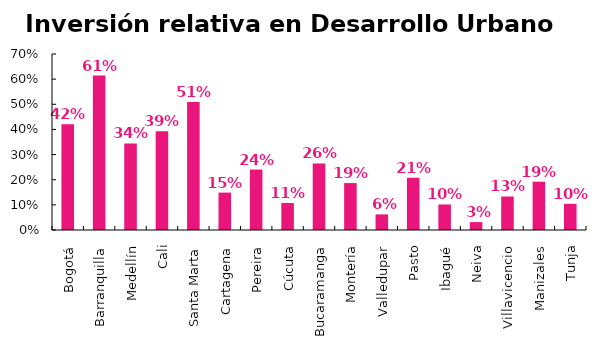
| Category | Inversión relativa en Desarrollo Urbano |
|---|---|
| Bogotá | 0.421 |
| Barranquilla | 0.614 |
| Medellín | 0.344 |
| Cali | 0.393 |
| Santa Marta | 0.51 |
| Cartagena | 0.149 |
| Pereira | 0.24 |
| Cúcuta | 0.107 |
| Bucaramanga | 0.265 |
| Montería | 0.187 |
| Valledupar | 0.062 |
| Pasto | 0.208 |
| Ibagué | 0.102 |
| Neiva | 0.031 |
| Villavicencio | 0.133 |
| Manizales | 0.192 |
| Tunja | 0.104 |